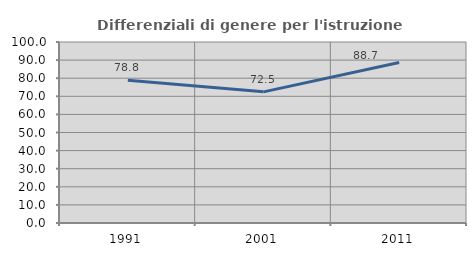
| Category | Differenziali di genere per l'istruzione superiore |
|---|---|
| 1991.0 | 78.815 |
| 2001.0 | 72.46 |
| 2011.0 | 88.719 |